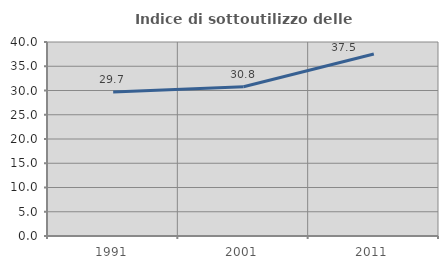
| Category | Indice di sottoutilizzo delle abitazioni  |
|---|---|
| 1991.0 | 29.681 |
| 2001.0 | 30.76 |
| 2011.0 | 37.525 |